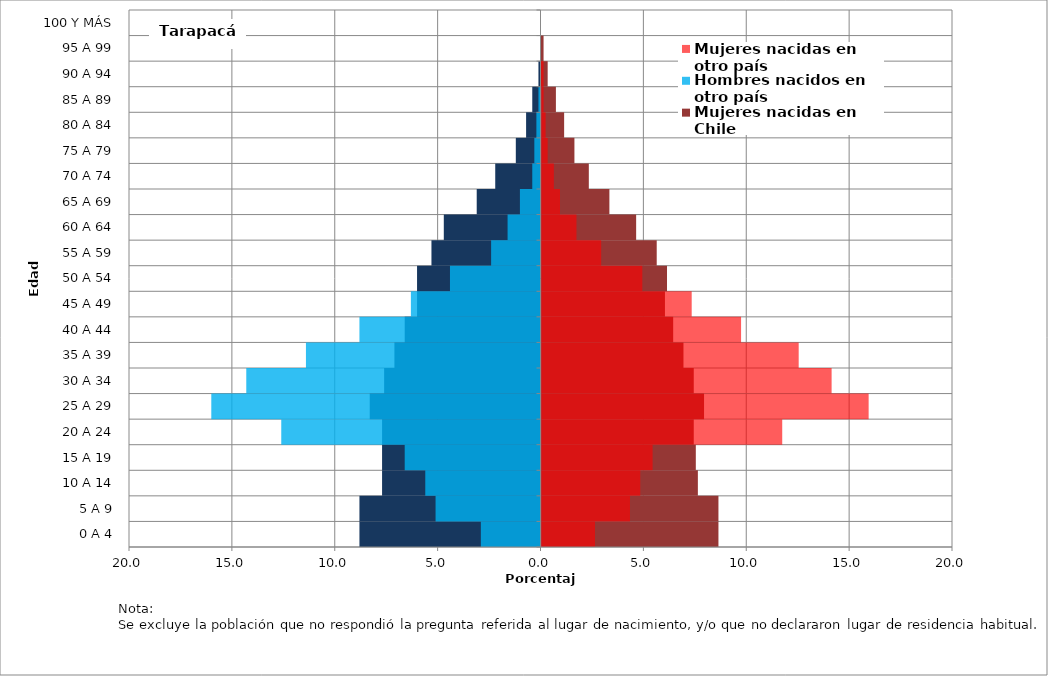
| Category | Hombres nacidos en Chile | Mujeres nacidas en Chile | Hombres nacidos en otro país | Mujeres nacidas en otro país |
|---|---|---|---|---|
| 0 A 4 | -8.8 | 8.6 | -2.9 | 2.6 |
| 5 A 9 | -8.8 | 8.6 | -5.1 | 4.3 |
| 10 A 14 | -7.7 | 7.6 | -5.6 | 4.8 |
| 15 A 19 | -7.7 | 7.5 | -6.6 | 5.4 |
| 20 A 24 | -7.7 | 7.4 | -12.6 | 11.7 |
| 25 A 29 | -8.3 | 7.9 | -16 | 15.9 |
| 30 A 34 | -7.6 | 7.4 | -14.3 | 14.1 |
| 35 A 39 | -7.1 | 6.9 | -11.4 | 12.5 |
| 40 A 44 | -6.6 | 6.4 | -8.8 | 9.7 |
| 45 A 49 | -6 | 6 | -6.3 | 7.3 |
| 50 A 54 | -6 | 6.1 | -4.4 | 4.9 |
| 55 A 59 | -5.3 | 5.6 | -2.4 | 2.9 |
| 60 A 64 | -4.7 | 4.6 | -1.6 | 1.7 |
| 65 A 69 | -3.1 | 3.3 | -1 | 0.9 |
| 70 A 74 | -2.2 | 2.3 | -0.4 | 0.6 |
| 75 A 79 | -1.2 | 1.6 | -0.3 | 0.3 |
| 80 A 84 | -0.7 | 1.1 | -0.2 | 0.2 |
| 85 A 89 | -0.4 | 0.7 | -0.1 | 0.1 |
| 90 A 94 | -0.1 | 0.3 | 0 | 0.1 |
| 95 A 99 | 0 | 0.1 | 0 | 0 |
| 100 Y MÁS | 0 | 0 | 0 | 0 |